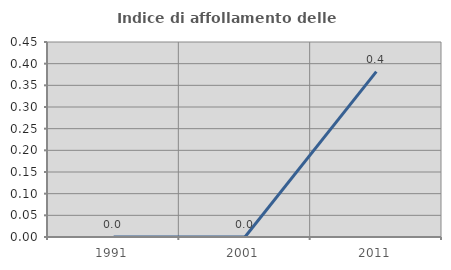
| Category | Indice di affollamento delle abitazioni  |
|---|---|
| 1991.0 | 0 |
| 2001.0 | 0 |
| 2011.0 | 0.382 |